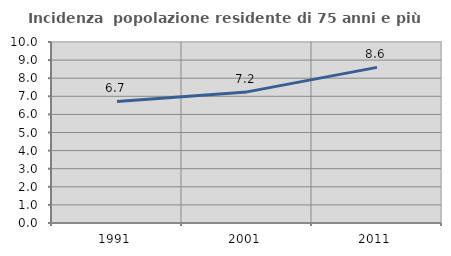
| Category | Incidenza  popolazione residente di 75 anni e più |
|---|---|
| 1991.0 | 6.717 |
| 2001.0 | 7.244 |
| 2011.0 | 8.598 |